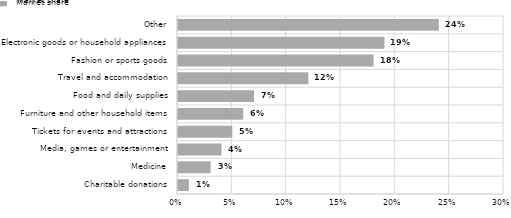
| Category | Market share |
|---|---|
| Charitable donations | 0.01 |
| Medicine | 0.03 |
| Media, games or entertainment | 0.04 |
| Tickets for events and attractions | 0.05 |
| Furniture and other household items | 0.06 |
| Food and daily supplies | 0.07 |
| Travel and accommodation | 0.12 |
| Fashion or sports goods | 0.18 |
| Electronic goods or household appliances | 0.19 |
| Other | 0.24 |